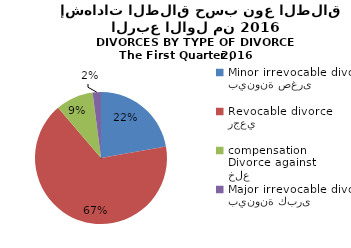
| Category | Series 1 |
|---|---|
| بينونة صغرى
Minor irrevocable divorce  | 65 |
| رجعي
Revocable divorce  | 195 |
| خلع
Divorce against compensation | 27 |
| بينونة كبرى
Major irrevocable divorce  | 6 |